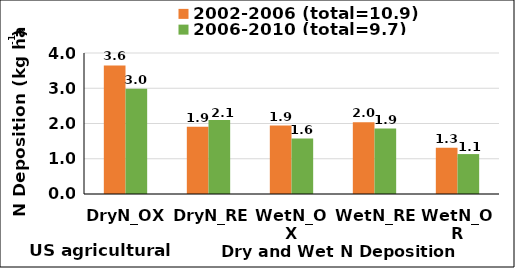
| Category | 2002-2006 (total=10.9) | 2006-2010 (total=9.7) |
|---|---|---|
| DryN_OX | 3.648 | 2.982 |
| DryN_RE | 1.911 | 2.103 |
| WetN_OX | 1.941 | 1.572 |
| WetN_RE | 2.039 | 1.86 |
| WetN_OR | 1.313 | 1.133 |